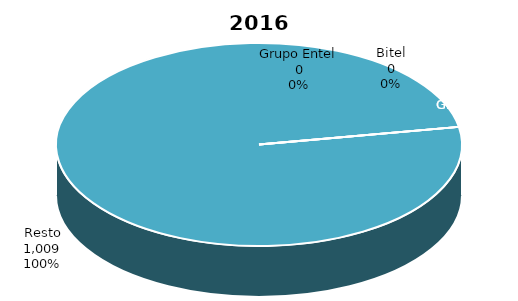
| Category | Series 0 |
|---|---|
| Grupo Telefónica | 0 |
| Grupo Claro | 0 |
| Grupo Entel | 0 |
| Bitel | 0 |
| Resto | 1008.644 |